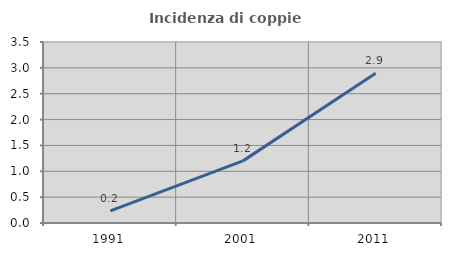
| Category | Incidenza di coppie miste |
|---|---|
| 1991.0 | 0.236 |
| 2001.0 | 1.201 |
| 2011.0 | 2.894 |